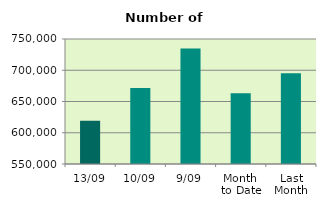
| Category | Series 0 |
|---|---|
| 13/09 | 619258 |
| 10/09 | 671514 |
| 9/09 | 734768 |
| Month 
to Date | 663216 |
| Last
Month | 695004.455 |